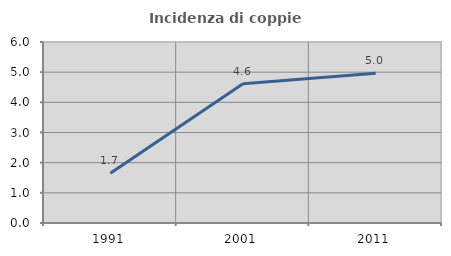
| Category | Incidenza di coppie miste |
|---|---|
| 1991.0 | 1.653 |
| 2001.0 | 4.615 |
| 2011.0 | 4.962 |